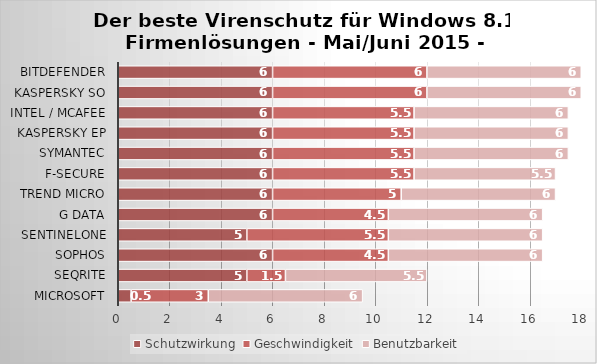
| Category | Schutzwirkung | Geschwindigkeit | Benutzbarkeit |
|---|---|---|---|
| Microsoft | 0.5 | 3 | 6 |
| Seqrite | 5 | 1.5 | 5.5 |
| Sophos | 6 | 4.5 | 6 |
| SentinelOne | 5 | 5.5 | 6 |
| G Data | 6 | 4.5 | 6 |
| Trend Micro | 6 | 5 | 6 |
| F-Secure | 6 | 5.5 | 5.5 |
| Symantec | 6 | 5.5 | 6 |
| Kaspersky EP | 6 | 5.5 | 6 |
| Intel / McAfee | 6 | 5.5 | 6 |
| Kaspersky SO | 6 | 6 | 6 |
| Bitdefender | 6 | 6 | 6 |